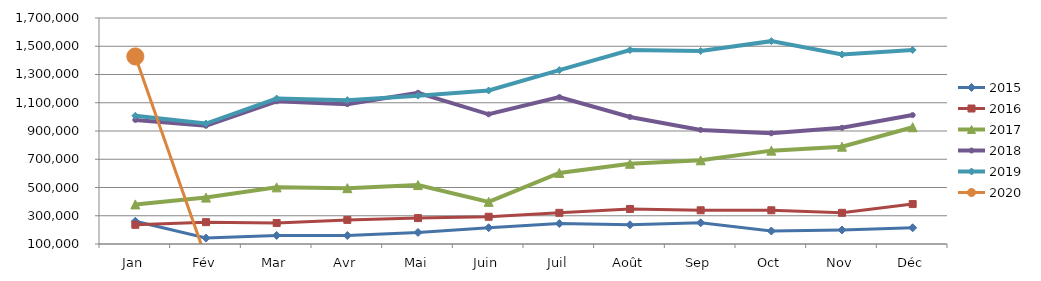
| Category | 2015 | 2016 | 2017 | 2018 | 2019 | 2020 |
|---|---|---|---|---|---|---|
| Jan | 261318.341 | 235903.093 | 380222.25 | 978468.279 | 1007982.373 | 1427566.131 |
| Fév | 141903.915 | 254650.591 | 428502.997 | 937137.209 | 952616.766 | 0 |
| Mar | 160681.774 | 248425.98 | 500955.694 | 1110199.711 | 1129815.679 | 0 |
| Avr | 159954.523 | 270687.752 | 495255.535 | 1090229.308 | 1118398.221 | 0 |
| Mai | 181677.436 | 283507.34 | 517298.538 | 1170512.154 | 1150217.455 | 0 |
| Juin | 215418.896 | 292820.053 | 398427.247 | 1018295.812 | 1186623.687 | 0 |
| Juil | 244989.187 | 320615.91 | 603419.402 | 1140133.118 | 1330812.699 | 0 |
| Août | 235890.85 | 348014.816 | 667973.667 | 999343.146 | 1473280.035 | 0 |
| Sep | 250009.095 | 338807.949 | 692403.495 | 907808.882 | 1466448.158 | 0 |
| Oct | 191980.124 | 338820.212 | 760969.174 | 883825.979 | 1536100.268 | 0 |
| Nov | 199530.979 | 320858.147 | 789037.665 | 922678.039 | 1441770.199 | 0 |
| Déc | 214723.876 | 382727.181 | 926372.399 | 1012620.724 | 1473565.92 | 0 |